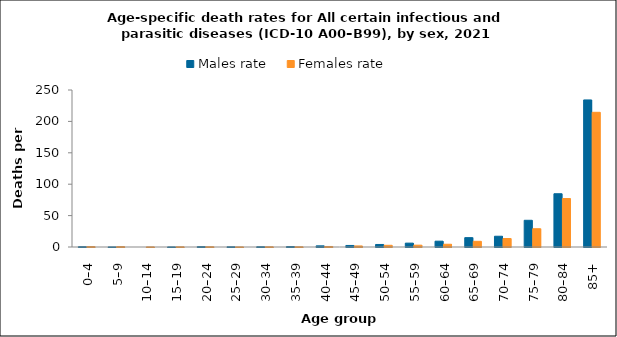
| Category | Males rate | Females rate |
|---|---|---|
| 0–4 | 0.515 | 0.682 |
| 5–9 | 0.12 | 0.637 |
| 10–14 | 0 | 0.127 |
| 15–19 | 0.131 | 0.279 |
| 20–24 | 0.597 | 0.382 |
| 25–29 | 0.327 | 0.111 |
| 30–34 | 0.425 | 0.313 |
| 35–39 | 0.754 | 0.319 |
| 40–44 | 1.838 | 0.835 |
| 45–49 | 2.447 | 1.681 |
| 50–54 | 4.029 | 2.691 |
| 55–59 | 6.164 | 2.919 |
| 60–64 | 9.28 | 4.378 |
| 65–69 | 14.898 | 9.055 |
| 70–74 | 17.127 | 13.512 |
| 75–79 | 42.543 | 29.092 |
| 80–84 | 84.813 | 77.171 |
| 85+ | 234.176 | 214.477 |